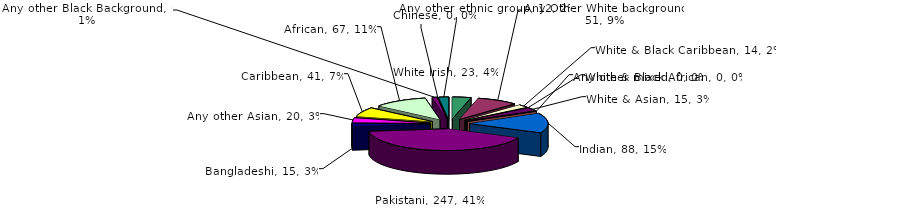
| Category | Series 0 |
|---|---|
| White Irish | 23 |
| Any Other White background | 51 |
| White & Black Caribbean | 14 |
| White & Black African | 0 |
| White & Asian | 15 |
| Any other mixed | 0 |
| Indian | 88 |
| Pakistani | 247 |
| Bangladeshi | 15 |
| Any other Asian | 20 |
| Caribbean | 41 |
| African | 67 |
| Any other Black Background | 6 |
| Chinese | 0 |
| Any other ethnic group | 12 |